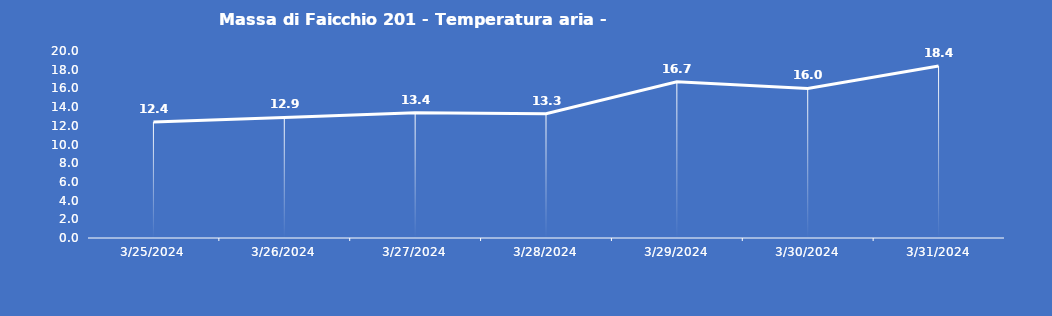
| Category | Massa di Faicchio 201 - Temperatura aria - Grezzo (°C) |
|---|---|
| 3/25/24 | 12.4 |
| 3/26/24 | 12.9 |
| 3/27/24 | 13.4 |
| 3/28/24 | 13.3 |
| 3/29/24 | 16.7 |
| 3/30/24 | 16 |
| 3/31/24 | 18.4 |